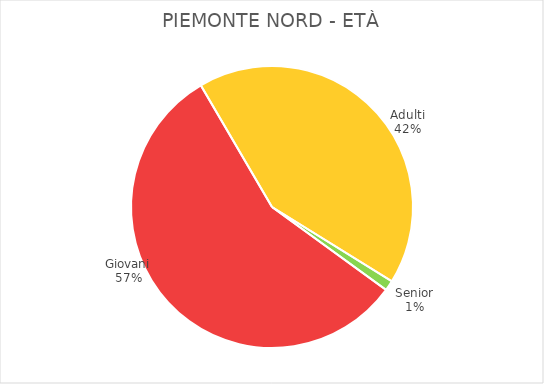
| Category | Piemonte Nord |
|---|---|
| Giovani | 7878 |
| Adulti | 5884 |
| Senior | 163 |